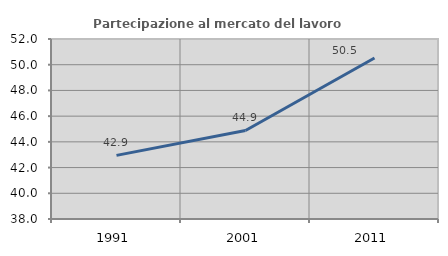
| Category | Partecipazione al mercato del lavoro  femminile |
|---|---|
| 1991.0 | 42.947 |
| 2001.0 | 44.885 |
| 2011.0 | 50.523 |